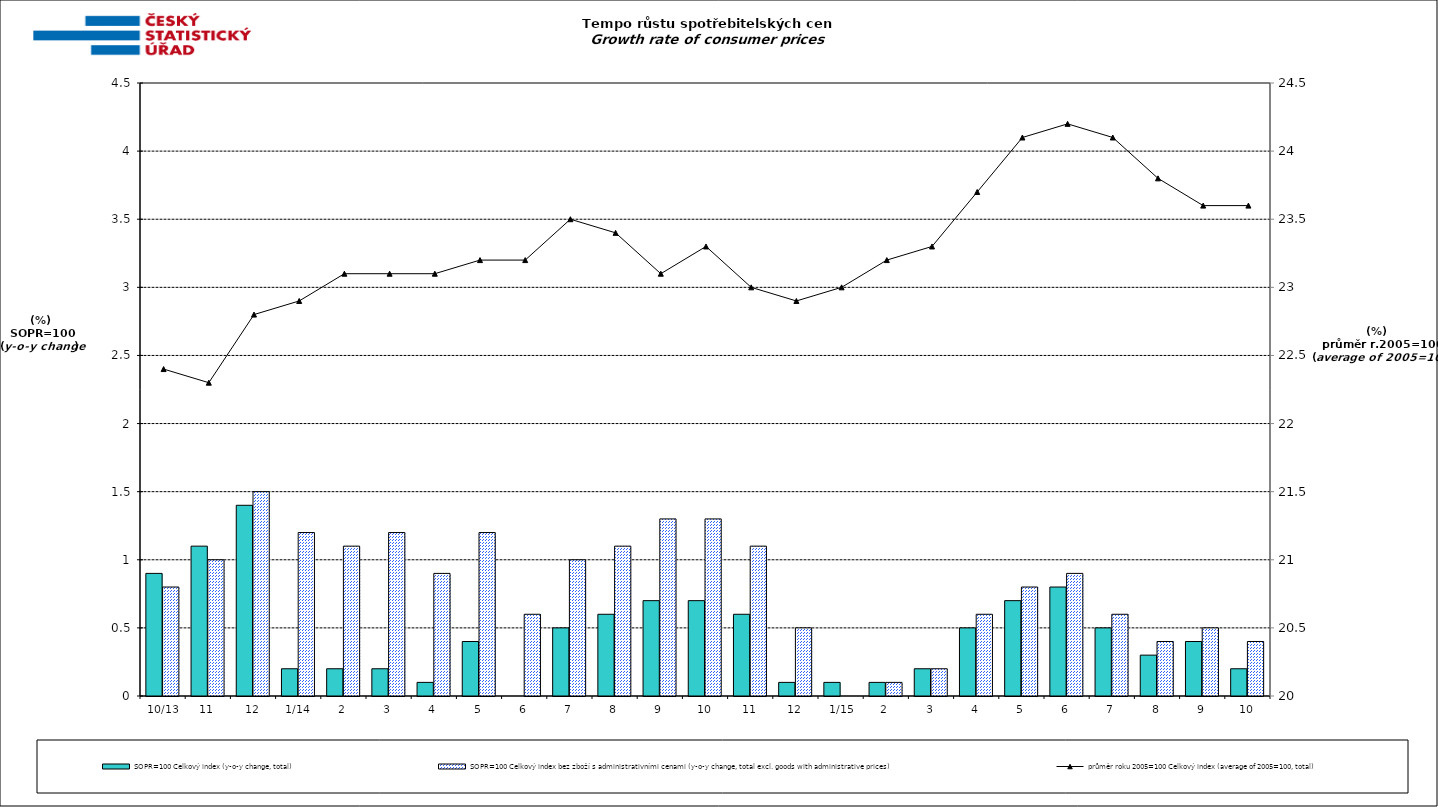
| Category | SOPR=100 Celkový index (y-o-y change, total) | SOPR=100 Celkový index bez zboží s administrativními cenami (y-o-y change, total excl. goods with administrative prices)  |
|---|---|---|
|  10/13 | 0.9 | 0.8 |
| 11 | 1.1 | 1 |
| 12 | 1.4 | 1.5 |
| 1/14 | 0.2 | 1.2 |
| 2 | 0.2 | 1.1 |
| 3 | 0.2 | 1.2 |
| 4 | 0.1 | 0.9 |
| 5 | 0.4 | 1.2 |
| 6 | 0 | 0.6 |
| 7 | 0.5 | 1 |
| 8 | 0.6 | 1.1 |
| 9 | 0.7 | 1.3 |
| 10 | 0.7 | 1.3 |
| 11 | 0.6 | 1.1 |
| 12 | 0.1 | 0.5 |
|  1/15 | 0.1 | 0 |
| 2 | 0.1 | 0.1 |
| 3 | 0.2 | 0.2 |
| 4 | 0.5 | 0.6 |
| 5 | 0.7 | 0.8 |
| 6 | 0.8 | 0.9 |
| 7 | 0.5 | 0.6 |
| 8 | 0.3 | 0.4 |
| 9 | 0.4 | 0.5 |
| 10 | 0.2 | 0.4 |